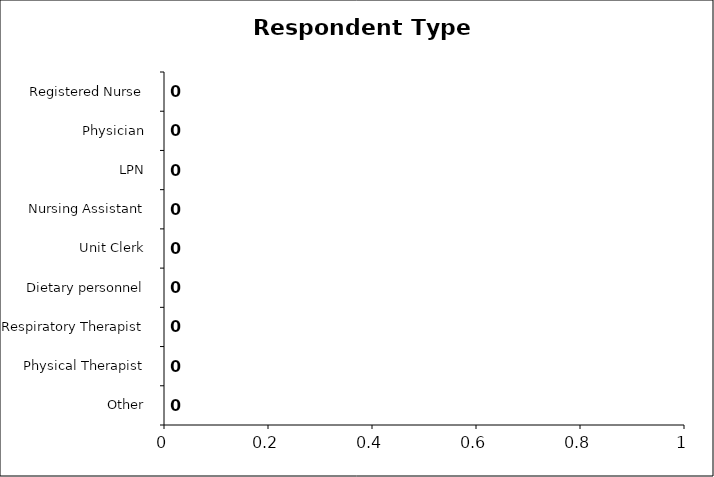
| Category | Series 0 |
|---|---|
| Other  | 0 |
| Physical Therapist  | 0 |
| Respiratory Therapist  | 0 |
| Dietary personnel  | 0 |
| Unit Clerk  | 0 |
| Nursing Assistant  | 0 |
| LPN  | 0 |
| Physician  | 0 |
| Registered Nurse  | 0 |